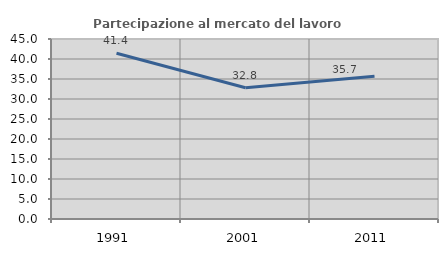
| Category | Partecipazione al mercato del lavoro  femminile |
|---|---|
| 1991.0 | 41.435 |
| 2001.0 | 32.81 |
| 2011.0 | 35.68 |